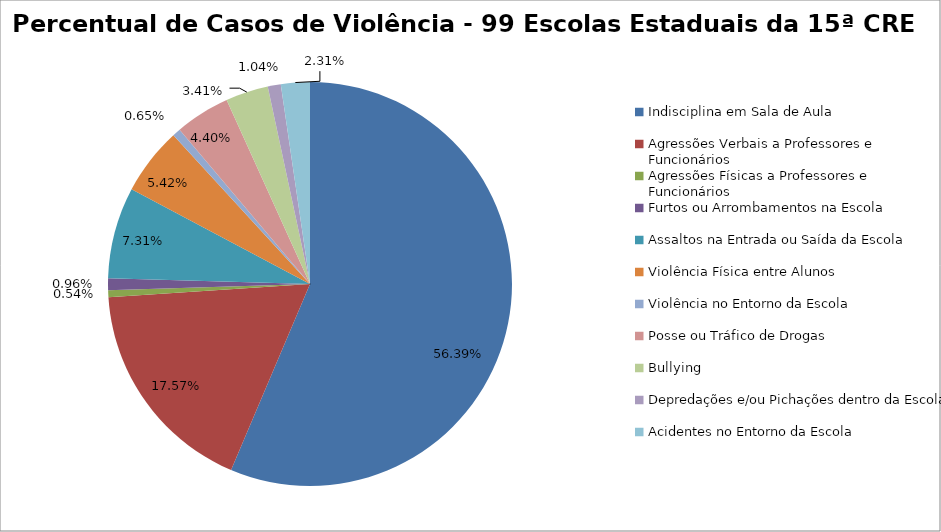
| Category | Percentual |
|---|---|
| Indisciplina em Sala de Aula | 0.564 |
| Agressões Verbais a Professores e Funcionários | 0.176 |
| Agressões Físicas a Professores e Funcionários | 0.005 |
| Furtos ou Arrombamentos na Escola | 0.01 |
| Assaltos na Entrada ou Saída da Escola | 0.073 |
| Violência Física entre Alunos | 0.054 |
| Violência no Entorno da Escola | 0.006 |
| Posse ou Tráfico de Drogas | 0.044 |
| Bullying | 0.034 |
| Depredações e/ou Pichações dentro da Escola | 0.01 |
| Acidentes no Entorno da Escola | 0.023 |